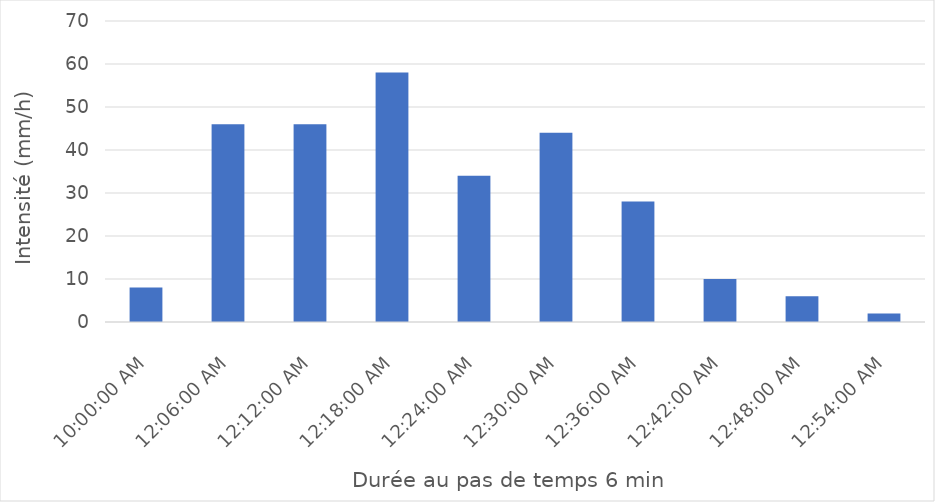
| Category | Series 0 |
|---|---|
| 0.0 | 8 |
| 0.004166666666666667 | 46 |
| 0.00833333333333333 | 46 |
| 0.0125 | 58 |
| 0.0166666666666667 | 34 |
| 0.0208333333333333 | 44 |
| 0.025 | 28 |
| 0.0291666666666667 | 10 |
| 0.0333333333333333 | 6 |
| 0.0375 | 2 |